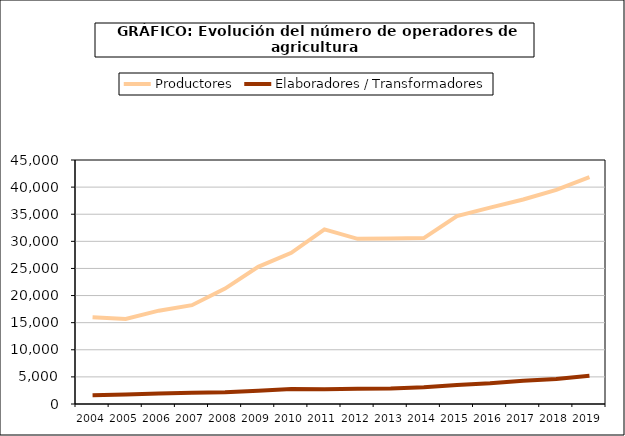
| Category | Productores | Elaboradores / Transformadores |
|---|---|---|
| 2004.0 | 16013 | 1635 |
| 2005.0 | 15693 | 1764 |
| 2006.0 | 17214 | 1942 |
| 2007.0 | 18226 | 2061 |
| 2008.0 | 21291 | 2168 |
| 2009.0 | 25291 | 2465 |
| 2010.0 | 27877 | 2747 |
| 2011.0 | 32206 | 2729 |
| 2012.0 | 30462 | 2790 |
| 2013.0 | 30502 | 2842 |
| 2014.0 | 30602 | 3082 |
| 2015.0 | 34673 | 3492 |
| 2016.0 | 36207 | 3810 |
| 2017.0 | 37712 | 4297 |
| 2018.0 | 39505 | 4627 |
| 2019.0 | 41838 | 5230 |